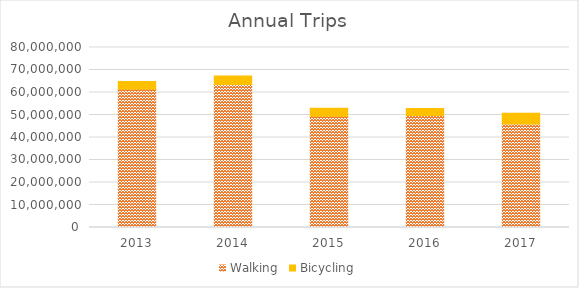
| Category | Walking | Bicycling |
|---|---|---|
| 2013 | 61399321.159 | 3494097.643 |
| 2014 | 63577024.628 | 3754947.196 |
| 2015 | 49426077.988 | 3604563.29 |
| 2016 | 49824955.464 | 3101475.916 |
| 2017 | 46036696.643 | 4788574.157 |